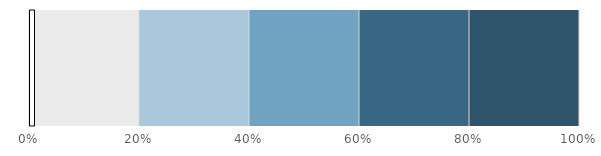
| Category | Series 0 | Series 1 |
|---|---|---|
| 0 | -0.005 | 0.01 |